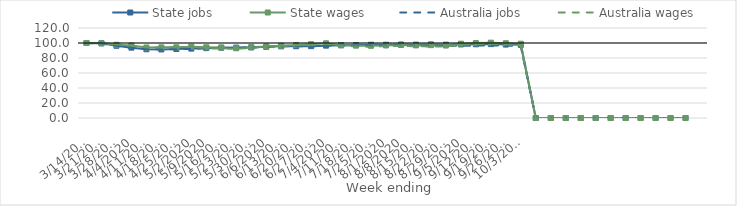
| Category | State jobs | State wages | Australia jobs | Australia wages |
|---|---|---|---|---|
| 14/03/2020 | 100 | 100 | 100 | 100 |
| 21/03/2020 | 99.593 | 99.54 | 99.271 | 99.673 |
| 28/03/2020 | 96.31 | 97.608 | 96.296 | 98.402 |
| 04/04/2020 | 93.819 | 96.685 | 93.638 | 96.698 |
| 11/04/2020 | 91.658 | 94.007 | 91.923 | 94.162 |
| 18/04/2020 | 91.409 | 94.172 | 91.471 | 94.06 |
| 25/04/2020 | 92.027 | 94.27 | 91.807 | 94.247 |
| 02/05/2020 | 92.504 | 95.044 | 92.206 | 94.699 |
| 09/05/2020 | 93.162 | 94.29 | 92.756 | 93.319 |
| 16/05/2020 | 93.74 | 93.907 | 93.289 | 92.663 |
| 23/05/2020 | 93.903 | 92.992 | 93.593 | 92.285 |
| 30/05/2020 | 94.161 | 94.345 | 94.094 | 93.58 |
| 06/06/2020 | 94.962 | 95.372 | 95.016 | 95.453 |
| 13/06/2020 | 95.523 | 96.33 | 95.471 | 96.086 |
| 20/06/2020 | 95.684 | 97.362 | 95.658 | 97.003 |
| 27/06/2020 | 95.778 | 98.39 | 95.603 | 97.208 |
| 04/07/2020 | 96.495 | 99.602 | 96.357 | 98.944 |
| 11/07/2020 | 97.032 | 97.001 | 96.686 | 95.884 |
| 18/07/2020 | 97.268 | 96.496 | 96.562 | 95.403 |
| 25/07/2020 | 97.656 | 96.277 | 96.622 | 95.053 |
| 01/08/2020 | 97.722 | 96.706 | 96.719 | 95.78 |
| 08/08/2020 | 98.021 | 97.332 | 96.574 | 96.121 |
| 15/08/2020 | 97.829 | 96.83 | 96.402 | 95.627 |
| 22/08/2020 | 98.145 | 97.112 | 96.279 | 95.418 |
| 29/08/2020 | 97.755 | 96.622 | 96.2 | 95.474 |
| 05/09/2020 | 98.048 | 99.069 | 96.273 | 97.682 |
| 12/09/2020 | 98.283 | 99.907 | 96.568 | 98.358 |
| 19/09/2020 | 98.503 | 100.43 | 96.733 | 98.934 |
| 26/09/2020 | 97.885 | 99.697 | 96.519 | 98.073 |
| 03/10/2020 | 97.506 | 99.056 | 95.865 | 96.714 |